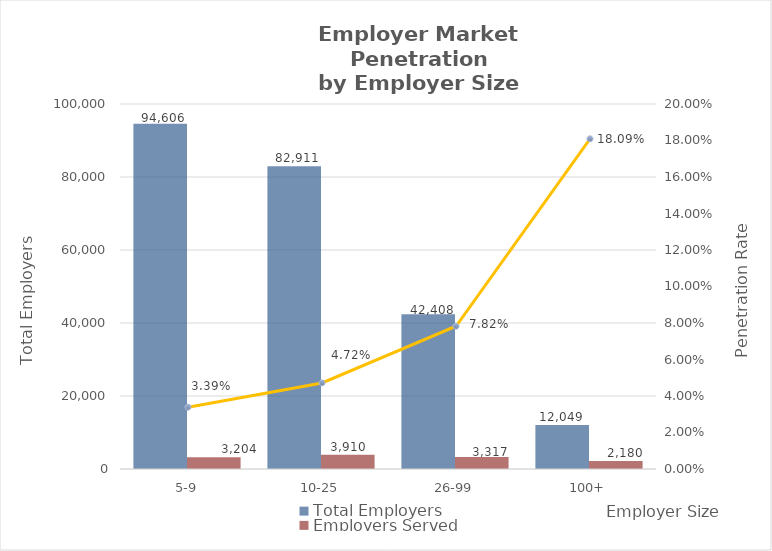
| Category | Total Employers | Employers Served |
|---|---|---|
| 5-9 | 94606 | 3204 |
| 10-25 | 82911 | 3910 |
| 26-99 | 42408 | 3317 |
| 100+ | 12049 | 2180 |